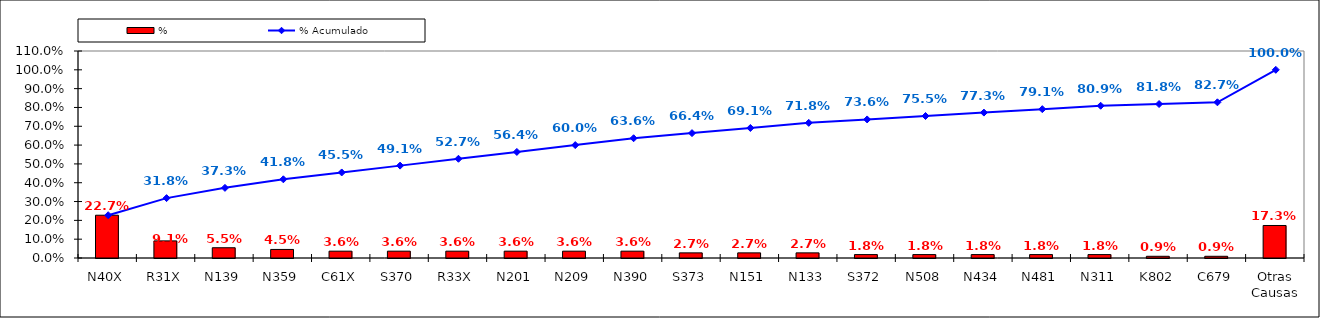
| Category | % |
|---|---|
| N40X | 0.227 |
| R31X | 0.091 |
| N139 | 0.055 |
| N359 | 0.045 |
| C61X | 0.036 |
| S370 | 0.036 |
| R33X | 0.036 |
| N201 | 0.036 |
| N209 | 0.036 |
| N390 | 0.036 |
| S373 | 0.027 |
| N151 | 0.027 |
| N133 | 0.027 |
| S372 | 0.018 |
| N508 | 0.018 |
| N434 | 0.018 |
| N481 | 0.018 |
| N311 | 0.018 |
| K802 | 0.009 |
| C679 | 0.009 |
| Otras Causas | 0.173 |